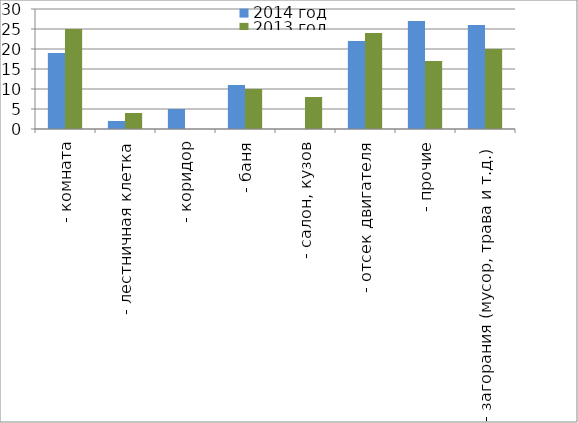
| Category | 2014 год | 2013 год |
|---|---|---|
|  - комната | 19 | 25 |
|  - лестничная клетка | 2 | 4 |
|  - коридор | 5 | 0 |
|  - баня | 11 | 10 |
|  - салон, кузов | 0 | 8 |
|  - отсек двигателя | 22 | 24 |
| - прочие | 27 | 17 |
| - загорания (мусор, трава и т.д.)  | 26 | 20 |